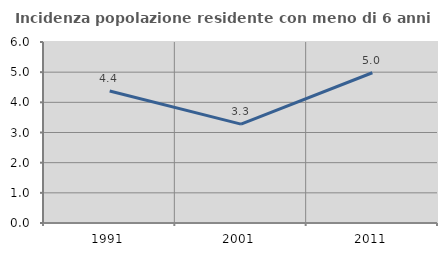
| Category | Incidenza popolazione residente con meno di 6 anni |
|---|---|
| 1991.0 | 4.376 |
| 2001.0 | 3.278 |
| 2011.0 | 4.98 |